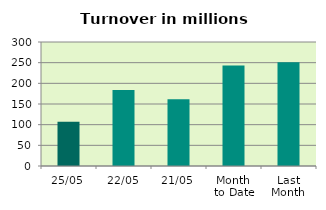
| Category | Series 0 |
|---|---|
| 25/05 | 107.194 |
| 22/05 | 183.646 |
| 21/05 | 161.514 |
| Month 
to Date | 243.217 |
| Last
Month | 250.745 |